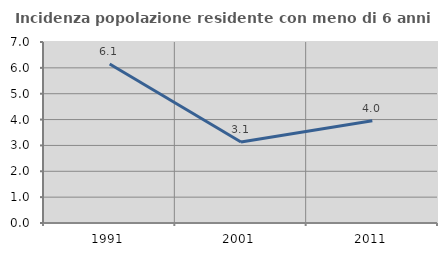
| Category | Incidenza popolazione residente con meno di 6 anni |
|---|---|
| 1991.0 | 6.149 |
| 2001.0 | 3.134 |
| 2011.0 | 3.952 |